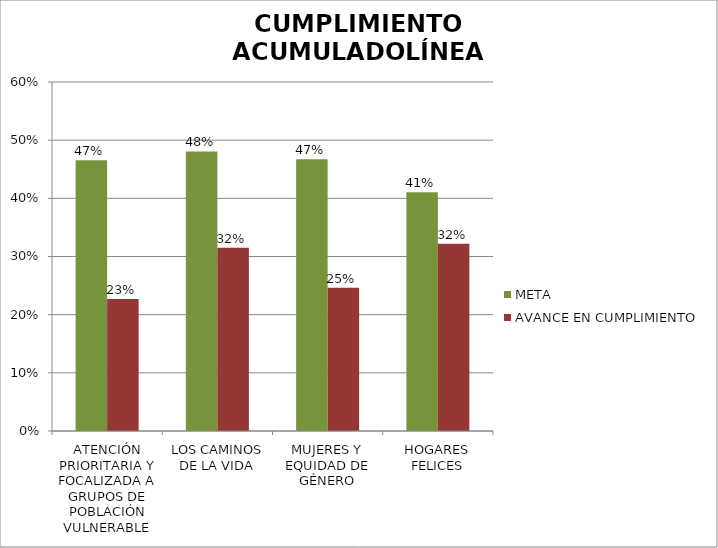
| Category | META | AVANCE EN CUMPLIMIENTO |
|---|---|---|
| ATENCIÓN PRIORITARIA Y FOCALIZADA A GRUPOS DE POBLACIÓN VULNERABLE | 0.465 | 0.227 |
| LOS CAMINOS DE LA VIDA | 0.481 | 0.315 |
| MUJERES Y EQUIDAD DE GÉNERO | 0.467 | 0.246 |
| HOGARES FELICES | 0.41 | 0.322 |